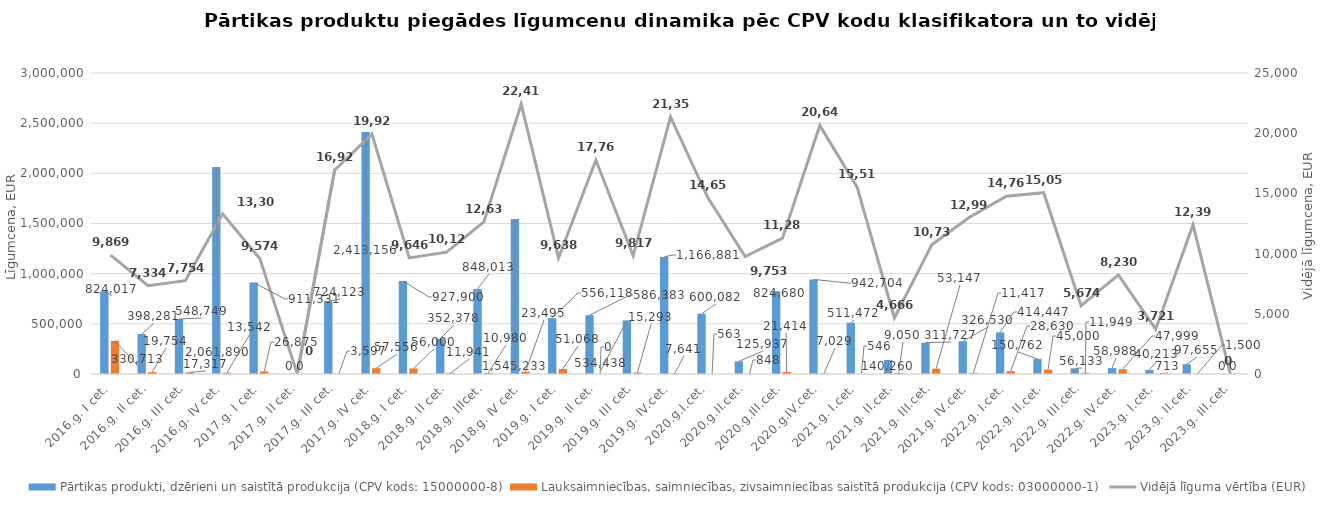
| Category | Pārtikas produkti, dzērieni un saistītā produkcija (CPV kods: 15000000-8) | Lauksaimniecības, saimniecības, zivsaimniecības saistītā produkcija (CPV kods: 03000000-1) |
|---|---|---|
| 2016.g. I cet. | 824017 | 330713 |
| 2016.g. II cet. | 398281 | 19754 |
| 2016.g. III cet. | 548749.01 | 17317 |
| 2016.g. IV cet. | 2061890 | 13542 |
| 2017.g. I cet. | 911330.81 | 26874.91 |
| 2017.g. II cet. | 0 | 0 |
| 2017.g. III cet. | 724123.07 | 3596.6 |
| 2017.g. IV cet. | 2413156 | 57556 |
| 2018.g. I cet. | 927900 | 56000 |
| 2018.g. II cet. | 352378 | 11941 |
| 2018.g. IIIcet. | 848013 | 10980 |
| 2018.g. IV cet. | 1545233 | 23495 |
| 2019.g. I cet. | 556118 | 51068 |
| 2019.g. II cet. | 586383 | 0 |
| 2019.g. III cet. | 534438 | 15293 |
| 2019.g. IV.cet. | 1166881 | 7641 |
| 2020.g.I.cet. | 600082 | 563 |
| 2020.g.II.cet. | 125937 | 848 |
| 2020.g.III.cet. | 824680 | 21414 |
| 2020.g.IV.cet. | 942704 | 7029 |
| 2021.g. I.cet. | 511472 | 546 |
| 2021.g. II.cet. | 140260 | 9050 |
| 2021.g. III.cet. | 311727 | 53147 |
| 2021.g. IV.cet. | 326530 | 11417 |
| 2022.g. I.cet. | 414447 | 28630 |
| 2022.g. II.cet. | 150762 | 45000 |
| 2022.g. III.cet. | 56133 | 11949 |
| 2022.g. IV.cet. | 58988 | 47999 |
| 2023.g. I.cet. | 40213 | 713 |
| 2023.g. II.cet. | 97655 | 1500 |
| 2023.g. III.cet. | 0 | 0 |